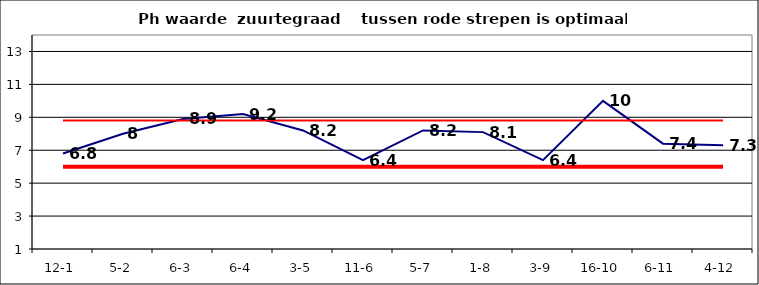
| Category | Series 0 | Series 1 | Series 2 |
|---|---|---|---|
| 12-1 | 6.8 | 6 | 8.8 |
| 5-2 | 8 | 6 | 8.8 |
| 6-3 | 8.9 | 6 | 8.8 |
| 6-4 | 9.2 | 6 | 8.8 |
| 3-5 | 8.2 | 6 | 8.8 |
| 11-6 | 6.4 | 6 | 8.8 |
| 5-7 | 8.2 | 6 | 8.8 |
| 1-8 | 8.1 | 6 | 8.8 |
| 3-9 | 6.4 | 6 | 8.8 |
| 16-10 | 10 | 6 | 8.8 |
| 6-11 | 7.4 | 6 | 8.8 |
| 4-12 | 7.3 | 6 | 8.8 |